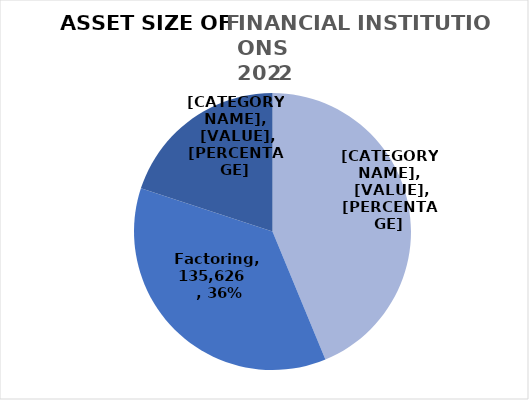
| Category | Series 0 |
|---|---|
| Leasing | 163580 |
| Factoring | 135626 |
| Financing | 74616 |